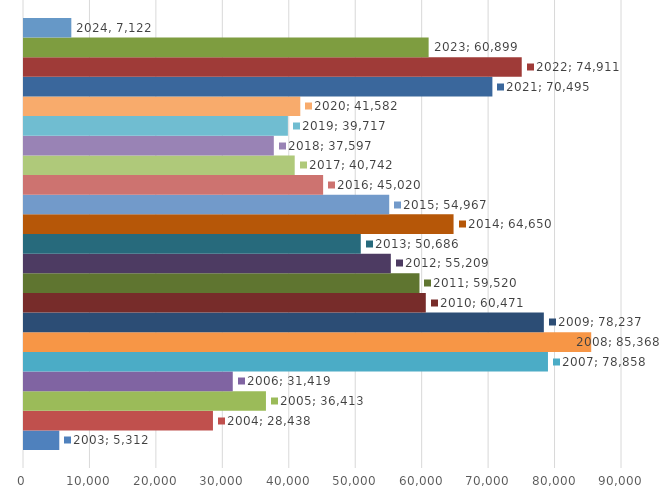
| Category | 2003 | 2004 | 2005 | 2006 | 2007 | 2008 | 2009 | 2010 | 2011 | 2012 | 2013 | 2014 | 2015 | 2016 | 2017 | 2018 | 2019 | 2020 | 2021 | 2022 | 2023 | 2024 |
|---|---|---|---|---|---|---|---|---|---|---|---|---|---|---|---|---|---|---|---|---|---|---|
| 0 | 5312 | 28438 | 36413 | 31419 | 78858 | 85368 | 78237 | 60471 | 59520 | 55209 | 50686 | 64650 | 54967 | 45020 | 40742 | 37597 | 39717 | 41582 | 70495 | 74911 | 60899 | 7122 |